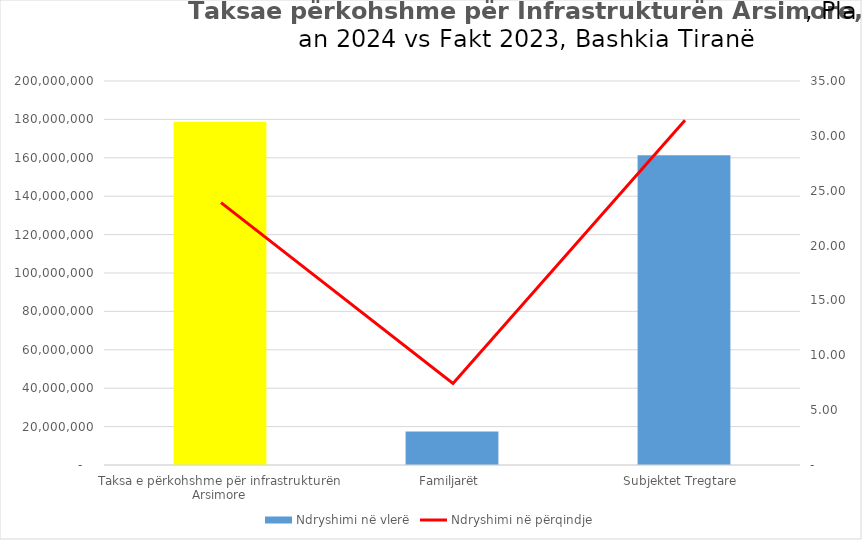
| Category | Ndryshimi në vlerë |
|---|---|
| Taksa e përkohshme për infrastrukturën Arsimore | 178772867 |
| Familjarët | 17388945 |
| Subjektet Tregtare  | 161383922 |